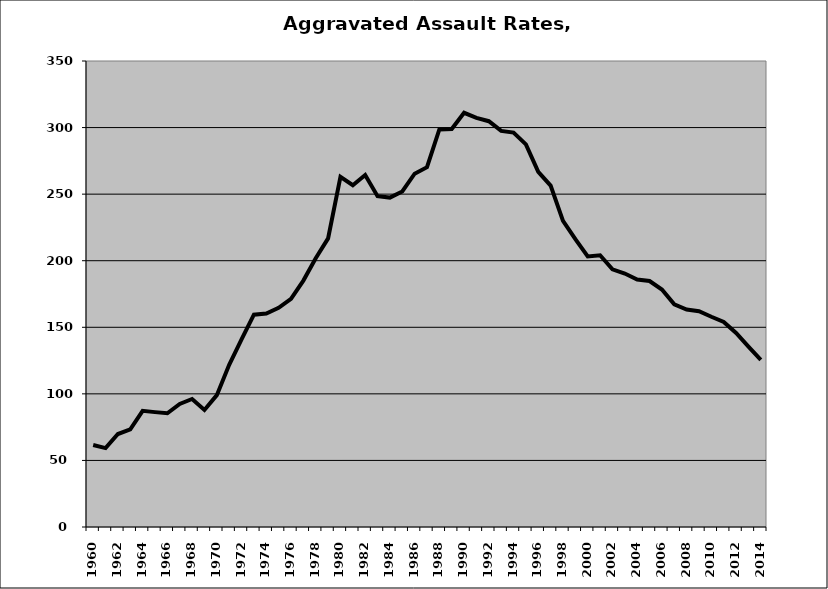
| Category | Aggravated Assault |
|---|---|
| 1960.0 | 61.565 |
| 1961.0 | 59.257 |
| 1962.0 | 69.832 |
| 1963.0 | 73.261 |
| 1964.0 | 87.219 |
| 1965.0 | 86.286 |
| 1966.0 | 85.402 |
| 1967.0 | 92.446 |
| 1968.0 | 96.143 |
| 1969.0 | 87.941 |
| 1970.0 | 99.035 |
| 1971.0 | 121.849 |
| 1972.0 | 140.831 |
| 1973.0 | 159.448 |
| 1974.0 | 160.314 |
| 1975.0 | 164.612 |
| 1976.0 | 171.36 |
| 1977.0 | 185.073 |
| 1978.0 | 201.856 |
| 1979.0 | 216.776 |
| 1980.0 | 263.042 |
| 1981.0 | 256.682 |
| 1982.0 | 264.372 |
| 1983.0 | 248.433 |
| 1984.0 | 247.412 |
| 1985.0 | 252.036 |
| 1986.0 | 265.354 |
| 1987.0 | 270.269 |
| 1988.0 | 298.64 |
| 1989.0 | 298.979 |
| 1990.0 | 311.105 |
| 1991.0 | 307.32 |
| 1992.0 | 304.789 |
| 1993.0 | 297.474 |
| 1994.0 | 296.23 |
| 1995.0 | 287.351 |
| 1996.0 | 266.738 |
| 1997.0 | 256.426 |
| 1998.0 | 229.982 |
| 1999.0 | 216.138 |
| 2000.0 | 203.212 |
| 2001.0 | 204.086 |
| 2002.0 | 193.499 |
| 2003.0 | 190.364 |
| 2004.0 | 185.88 |
| 2005.0 | 184.749 |
| 2006.0 | 178.336 |
| 2007.0 | 167.202 |
| 2008.0 | 163.354 |
| 2009.0 | 162.086 |
| 2010.0 | 157.93 |
| 2011.0 | 154.028 |
| 2012.0 | 145.685 |
| 2013.0 | 135.454 |
| 2014.0 | 125.585 |